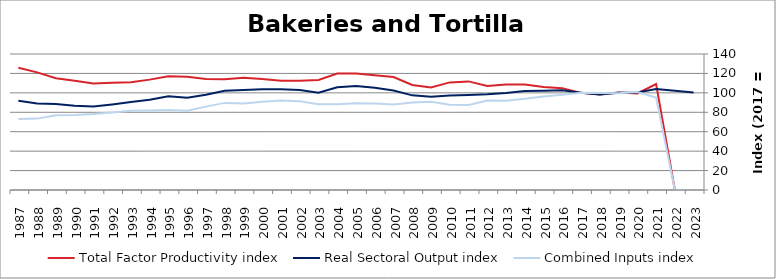
| Category | Total Factor Productivity index | Real Sectoral Output index | Combined Inputs index |
|---|---|---|---|
| 2023.0 | 0 | 100.29 | 0 |
| 2022.0 | 0 | 102.18 | 0 |
| 2021.0 | 109.068 | 103.911 | 95.272 |
| 2020.0 | 99.392 | 100.342 | 100.956 |
| 2019.0 | 100.398 | 100.006 | 99.61 |
| 2018.0 | 98.436 | 98.256 | 99.817 |
| 2017.0 | 100 | 100 | 100 |
| 2016.0 | 104.863 | 102.698 | 97.936 |
| 2015.0 | 105.971 | 102.105 | 96.352 |
| 2014.0 | 108.607 | 101.904 | 93.828 |
| 2013.0 | 108.689 | 99.873 | 91.889 |
| 2012.0 | 107.074 | 98.58 | 92.067 |
| 2011.0 | 111.8 | 97.844 | 87.517 |
| 2010.0 | 110.757 | 97.293 | 87.844 |
| 2009.0 | 105.638 | 96.001 | 90.877 |
| 2008.0 | 108.113 | 97.44 | 90.128 |
| 2007.0 | 116.335 | 102.521 | 88.126 |
| 2006.0 | 118.076 | 105.15 | 89.052 |
| 2005.0 | 120.033 | 107.084 | 89.213 |
| 2004.0 | 119.85 | 105.762 | 88.245 |
| 2003.0 | 113.264 | 100.071 | 88.352 |
| 2002.0 | 112.513 | 102.907 | 91.462 |
| 2001.0 | 112.417 | 103.64 | 92.193 |
| 2000.0 | 114.211 | 103.822 | 90.904 |
| 1999.0 | 115.434 | 102.902 | 89.144 |
| 1998.0 | 113.921 | 102.154 | 89.672 |
| 1997.0 | 114.256 | 98.085 | 85.847 |
| 1996.0 | 116.573 | 95.067 | 81.551 |
| 1995.0 | 117.037 | 96.464 | 82.422 |
| 1994.0 | 113.628 | 92.995 | 81.842 |
| 1993.0 | 110.949 | 90.535 | 81.601 |
| 1992.0 | 110.452 | 88.044 | 79.713 |
| 1991.0 | 109.656 | 85.901 | 78.337 |
| 1990.0 | 112.389 | 86.833 | 77.261 |
| 1989.0 | 115.023 | 88.616 | 77.042 |
| 1988.0 | 121.087 | 88.979 | 73.483 |
| 1987.0 | 125.875 | 91.854 | 72.973 |